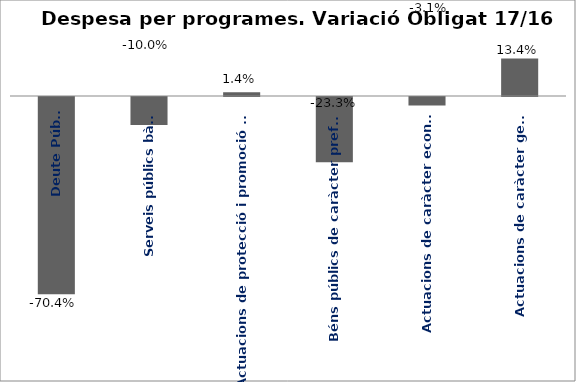
| Category | Series 0 |
|---|---|
| Deute Públic | -0.704 |
| Serveis públics bàsics | -0.1 |
| Actuacions de protecció i promoció social | 0.014 |
| Béns públics de caràcter preferent | -0.233 |
| Actuacions de caràcter econòmic | -0.031 |
| Actuacions de caràcter general | 0.134 |